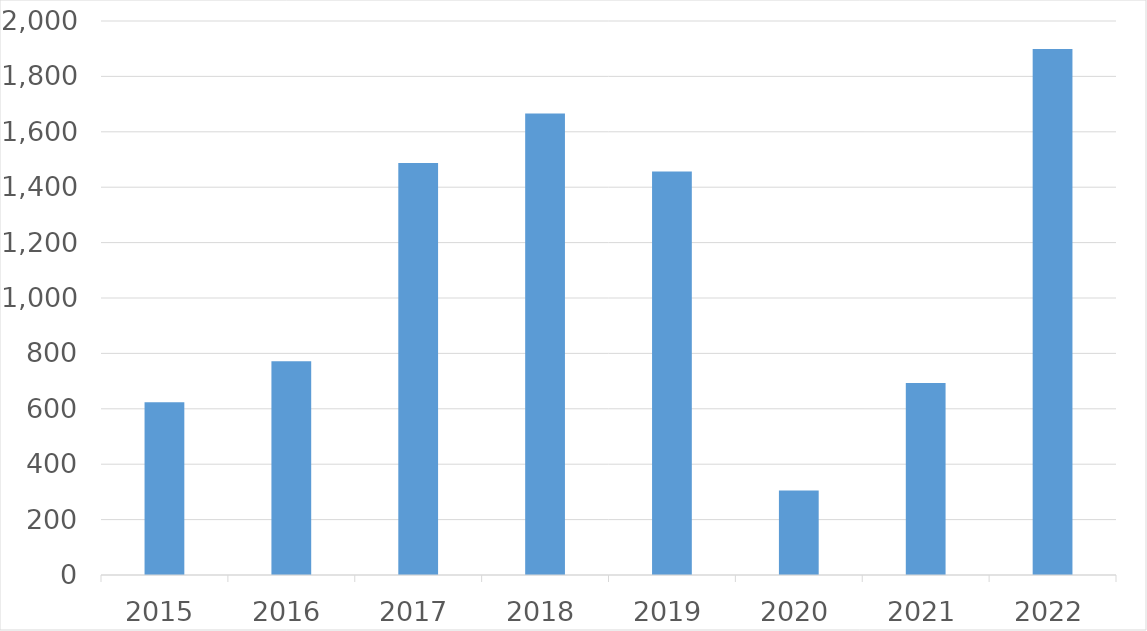
| Category | Series 0 |
|---|---|
| 2015 | 624 |
| 2016 | 772 |
| 2017 | 1487 |
| 2018 | 1666 |
| 2019 | 1457 |
| 2020 | 305 |
| 2021 | 693 |
| 2022 | 1899 |